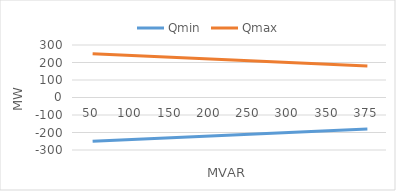
| Category | Qmin | Qmax |
|---|---|---|
| 50.0 | -250 | 250 |
| 100.0 | -240 | 240 |
| 150.0 | -230 | 230 |
| 200.0 | -220 | 220 |
| 250.0 | -210 | 210 |
| 300.0 | -200 | 200 |
| 350.0 | -190 | 190 |
| 375.0 | -180 | 180 |